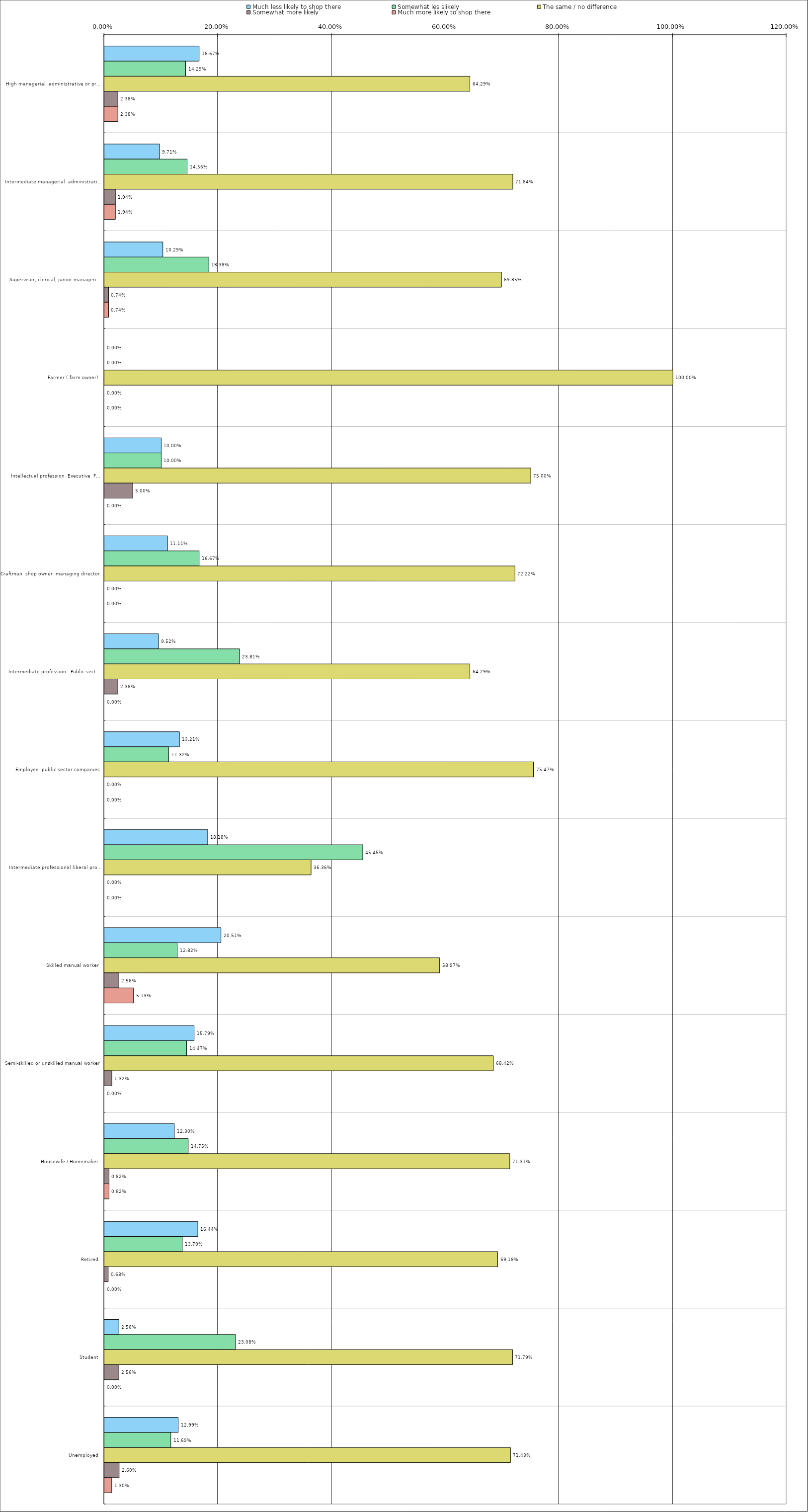
| Category | Much less likely to shop there | Somewhat les slikely | The same / no difference | Somewhat more likely | Much more likely to shop there |
|---|---|---|---|---|---|
| 0 | 0.167 | 0.143 | 0.643 | 0.024 | 0.024 |
| 1 | 0.097 | 0.146 | 0.718 | 0.019 | 0.019 |
| 2 | 0.103 | 0.184 | 0.698 | 0.007 | 0.007 |
| 3 | 0 | 0 | 1 | 0 | 0 |
| 4 | 0.1 | 0.1 | 0.75 | 0.05 | 0 |
| 5 | 0.111 | 0.167 | 0.722 | 0 | 0 |
| 6 | 0.095 | 0.238 | 0.643 | 0.024 | 0 |
| 7 | 0.132 | 0.113 | 0.755 | 0 | 0 |
| 8 | 0.182 | 0.454 | 0.364 | 0 | 0 |
| 9 | 0.205 | 0.128 | 0.59 | 0.026 | 0.051 |
| 10 | 0.158 | 0.145 | 0.684 | 0.013 | 0 |
| 11 | 0.123 | 0.148 | 0.713 | 0.008 | 0.008 |
| 12 | 0.164 | 0.137 | 0.692 | 0.007 | 0 |
| 13 | 0.026 | 0.231 | 0.718 | 0.026 | 0 |
| 14 | 0.13 | 0.117 | 0.714 | 0.026 | 0.013 |